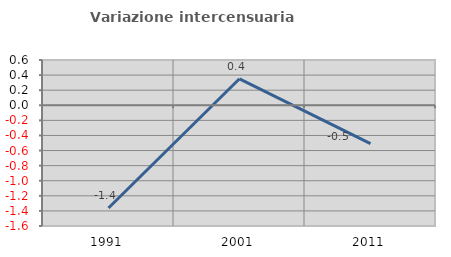
| Category | Variazione intercensuaria annua |
|---|---|
| 1991.0 | -1.362 |
| 2001.0 | 0.351 |
| 2011.0 | -0.507 |